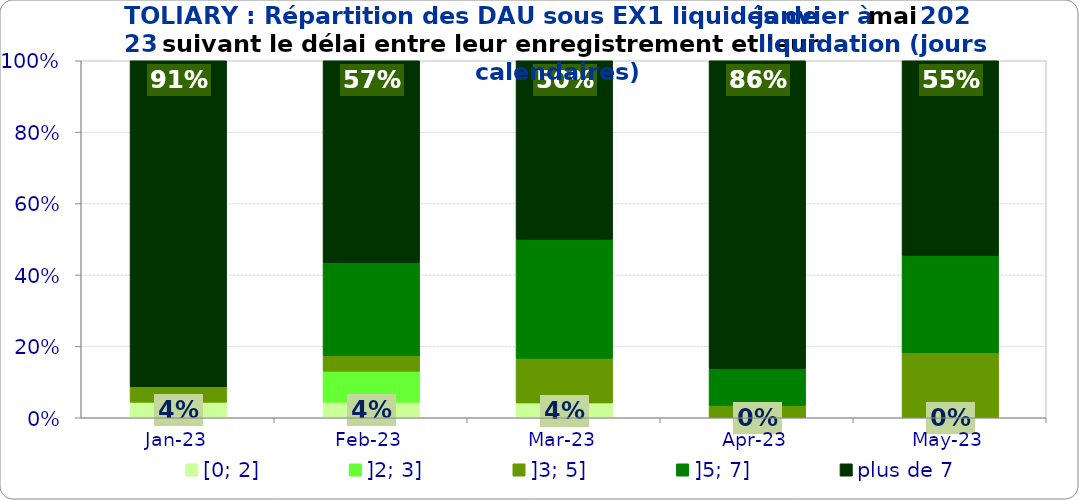
| Category | [0; 2] | ]2; 3] | ]3; 5] | ]5; 7] | plus de 7 |
|---|---|---|---|---|---|
| 2023-01-01 | 0.043 | 0 | 0.043 | 0 | 0.913 |
| 2023-02-01 | 0.043 | 0.087 | 0.043 | 0.261 | 0.565 |
| 2023-03-01 | 0.042 | 0 | 0.125 | 0.333 | 0.5 |
| 2023-04-01 | 0 | 0 | 0.034 | 0.103 | 0.862 |
| 2023-05-01 | 0 | 0 | 0.182 | 0.273 | 0.545 |